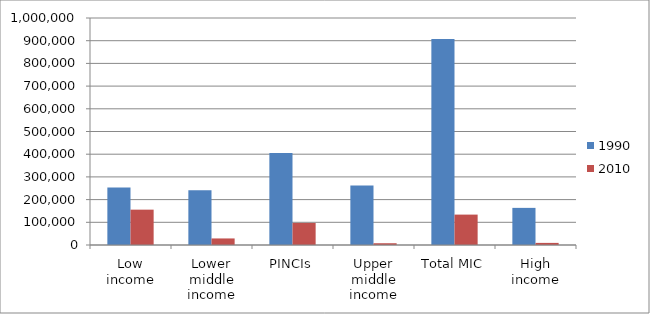
| Category | 1990 | 2010 |
|---|---|---|
| Low income | 253191 | 155738 |
| Lower middle income | 240848 | 28894 |
| PINCIs | 404889 | 97260 |
| Upper middle income | 262101 | 7759 |
| Total MIC | 907838 | 133913 |
| High income | 163558 | 9283 |